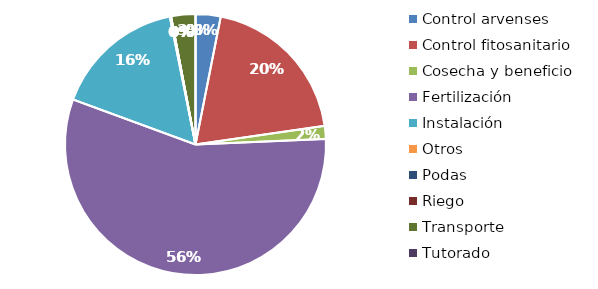
| Category | Valor |
|---|---|
| Control arvenses | 138521 |
| Control fitosanitario | 875225 |
| Cosecha y beneficio | 71592.699 |
| Fertilización | 2512174 |
| Instalación | 724876.081 |
| Otros | 6712 |
| Podas | 0 |
| Riego | 0 |
| Transporte | 134236 |
| Tutorado | 0 |